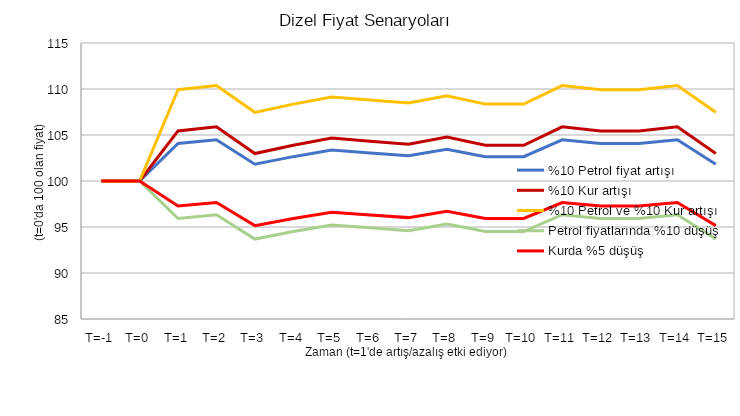
| Category | %10 Petrol fiyat artışı | %10 Kur artışı | %10 Petrol ve %10 Kur artışı | Petrol fiyatlarında %10 düşüş | Kurda %5 düşüş |
|---|---|---|---|---|---|
| T=-1 | 100 | 100 | 100 | 100 | 100 |
| T=0 | 100 | 100 | 100 | 100 | 100 |
| T=1 | 104.072 | 105.446 | 109.925 | 95.928 | 97.277 |
| T=2 | 104.479 | 105.894 | 110.373 | 96.335 | 97.664 |
| T=3 | 101.832 | 102.983 | 107.462 | 93.689 | 95.149 |
| T=4 | 102.647 | 103.878 | 108.357 | 94.503 | 95.923 |
| T=5 | 103.359 | 104.662 | 109.141 | 95.216 | 96.6 |
| T=6 | 103.054 | 104.326 | 108.805 | 94.91 | 96.31 |
| T=7 | 102.748 | 103.99 | 108.469 | 94.605 | 96.02 |
| T=8 | 103.461 | 104.774 | 109.253 | 95.317 | 96.697 |
| T=9 | 102.647 | 103.878 | 108.357 | 94.503 | 95.923 |
| T=10 | 102.647 | 103.878 | 108.357 | 94.503 | 95.923 |
| T=11 | 104.479 | 105.894 | 110.373 | 96.335 | 97.664 |
| T=12 | 104.072 | 105.446 | 109.925 | 95.928 | 97.277 |
| T=13 | 104.072 | 105.446 | 109.925 | 95.928 | 97.277 |
| T=14 | 104.479 | 105.894 | 110.373 | 96.335 | 97.664 |
| T=15 | 101.832 | 102.983 | 107.462 | 93.689 | 95.149 |